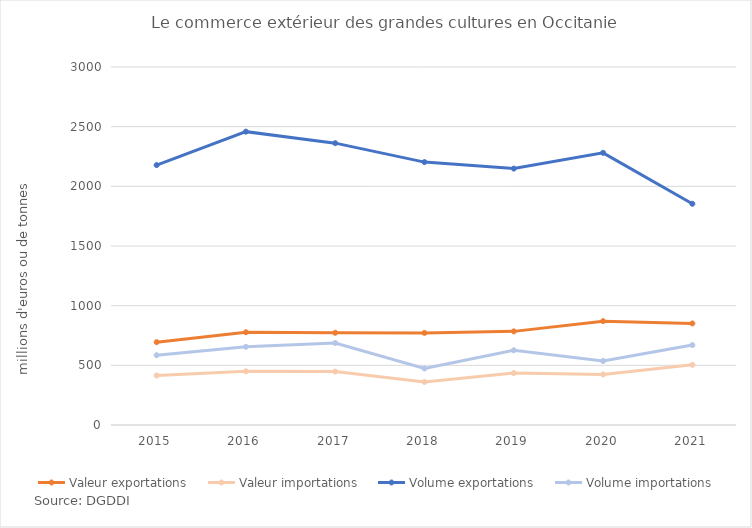
| Category | Valeur exportations | Valeur importations | Volume exportations | Volume importations |
|---|---|---|---|---|
| 2015.0 | 694.151 | 415.034 | 2178 | 584.845 |
| 2016.0 | 777.308 | 449.72 | 2458.198 | 655.288 |
| 2017.0 | 772.746 | 447.6 | 2361.888 | 687.232 |
| 2018.0 | 771.821 | 360.818 | 2203.097 | 473.394 |
| 2019.0 | 784.598 | 435.51 | 2148.592 | 626.163 |
| 2020.0 | 870.233 | 423.617 | 2280.764 | 536.293 |
| 2021.0 | 850.957 | 504.061 | 1853.918 | 669.667 |